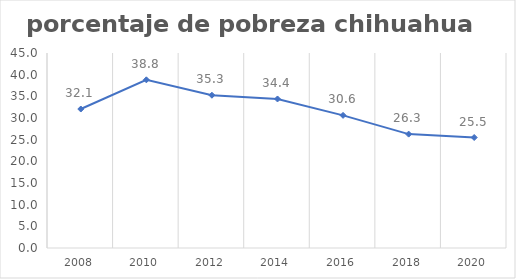
| Category | Series 0 |
|---|---|
| 2008.0 | 32.071 |
| 2010.0 | 38.807 |
| 2012.0 | 35.255 |
| 2014.0 | 34.391 |
| 2016.0 | 30.608 |
| 2018.0 | 26.281 |
| 2020.0 | 25.5 |